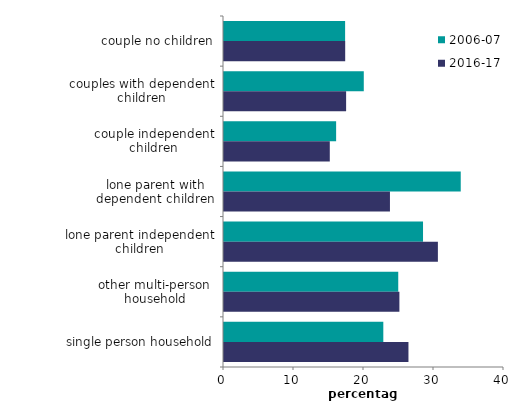
| Category | 2006-07 | 2016-17 |
|---|---|---|
| couple no children | 17.302 | 17.314 |
| couples with dependent children | 19.969 | 17.445 |
| couple independent children | 16.018 | 15.114 |
| lone parent with dependent children | 33.82 | 23.707 |
| lone parent independent children | 28.432 | 30.556 |
| other multi-person  household | 24.893 | 25.057 |
| single person household | 22.759 | 26.351 |